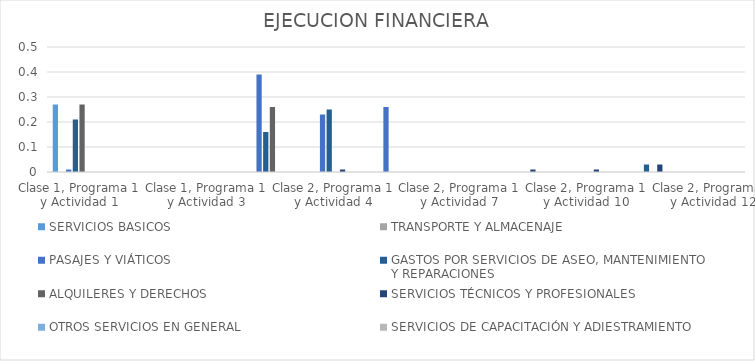
| Category | SERVICIOS BASICOS | TRANSPORTE Y ALMACENAJE | PASAJES Y VIÁTICOS | GASTOS POR SERVICIOS DE ASEO, MANTENIMIENTO
Y REPARACIONES | ALQUILERES Y DERECHOS | SERVICIOS TÉCNICOS Y PROFESIONALES | OTROS SERVICIOS EN GENERAL | SERVICIOS DE CAPACITACIÓN Y ADIESTRAMIENTO |
|---|---|---|---|---|---|---|---|---|
| Clase 1, Programa 1 y Actividad 1 | 0.27 | 0 | 0.01 | 0.21 | 0.27 | 0 | 0 | 0 |
| Clase 1, Programa 1 y Actividad 2 | 0 | 0 | 0 | 0 | 0 | 0 | 0 | 0 |
| Clase 1, Programa 1 y Actividad 3 | 0 | 0 | 0 | 0 | 0 | 0 | 0 | 0 |
| Clase 2, Programa 1 y Actividad 1 | 0 | 0 | 0.39 | 0.16 | 0.26 | 0 | 0 | 0 |
| Clase 2, Programa 1 y Actividad 4 | 0 | 0 | 0.23 | 0.25 | 0 | 0.01 | 0 | 0 |
| Clase 2, Programa 1 y Actividad 5 | 0 | 0 | 0.26 | 0 | 0 | 0 | 0 | 0 |
| Clase 2, Programa 1 y Actividad 7 | 0 | 0 | 0 | 0 | 0 | 0 | 0 | 0 |
| Clase 2, Programa 1 y Actividad 9 | 0 | 0 | 0 | 0 | 0 | 0.01 | 0 | 0 |
| Clase 2, Programa 1 y Actividad 10 | 0 | 0 | 0 | 0 | 0 | 0.01 | 0 | 0 |
| Clase 2, Programa 1 y Actividad 11 | 0 | 0 | 0 | 0.03 | 0 | 0.03 | 0 | 0 |
| Clase 2, Programa 1 y Actividad 12 | 0 | 0 | 0 | 0 | 0 | 0 | 0 | 0 |